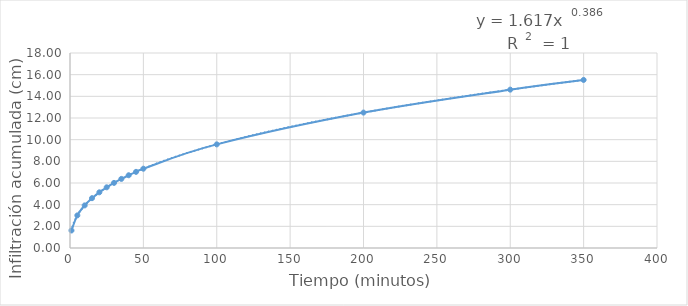
| Category | Series 0 |
|---|---|
| 1.0 | 1.617 |
| 5.0 | 3.01 |
| 10.0 | 3.933 |
| 15.0 | 4.599 |
| 20.0 | 5.139 |
| 25.0 | 5.602 |
| 30.0 | 6.01 |
| 35.0 | 6.379 |
| 40.0 | 6.716 |
| 45.0 | 7.028 |
| 50.0 | 7.32 |
| 100.0 | 9.566 |
| 200.0 | 12.5 |
| 300.0 | 14.618 |
| 350.0 | 15.514 |